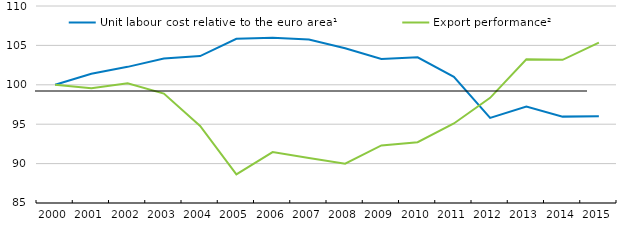
| Category | Unit labour cost relative to the euro area¹ | Export performance² |
|---|---|---|
| 2000.0 | 100 | 100 |
| 2001.0 | 101.406 | 99.559 |
| 2002.0 | 102.277 | 100.185 |
| 2003.0 | 103.333 | 98.886 |
| 2004.0 | 103.645 | 94.778 |
| 2005.0 | 105.836 | 88.629 |
| 2006.0 | 105.982 | 91.46 |
| 2007.0 | 105.752 | 90.72 |
| 2008.0 | 104.639 | 89.982 |
| 2009.0 | 103.28 | 92.305 |
| 2010.0 | 103.485 | 92.722 |
| 2011.0 | 101.017 | 95.09 |
| 2012.0 | 95.796 | 98.343 |
| 2013.0 | 97.249 | 103.231 |
| 2014.0 | 95.961 | 103.167 |
| 2015.0 | 96.024 | 105.354 |